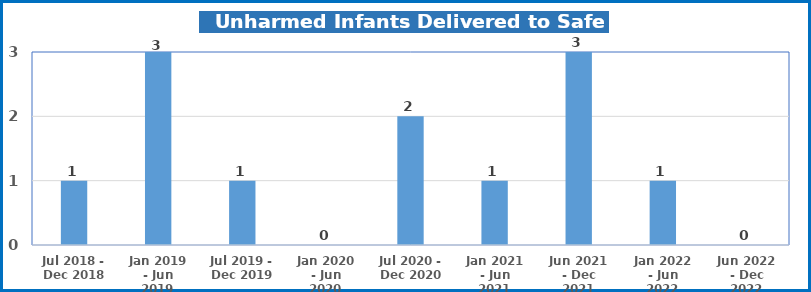
| Category | Series 0 |
|---|---|
| Jul 2018 - Dec 2018 | 1 |
| Jan 2019 - Jun 2019 | 3 |
| Jul 2019 - Dec 2019 | 1 |
| Jan 2020 - Jun 2020 | 0 |
| Jul 2020 - Dec 2020 | 2 |
| Jan 2021 - Jun 2021 | 1 |
| Jun 2021 - Dec 2021 | 3 |
| Jan 2022 - Jun 2022 | 1 |
| Jun 2022 - Dec 2022 | 0 |